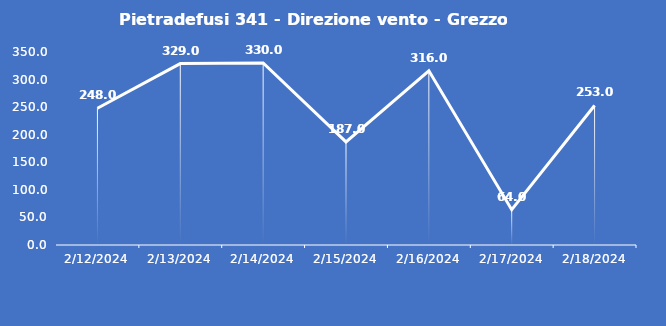
| Category | Pietradefusi 341 - Direzione vento - Grezzo (°N) |
|---|---|
| 2/12/24 | 248 |
| 2/13/24 | 329 |
| 2/14/24 | 330 |
| 2/15/24 | 187 |
| 2/16/24 | 316 |
| 2/17/24 | 64 |
| 2/18/24 | 253 |